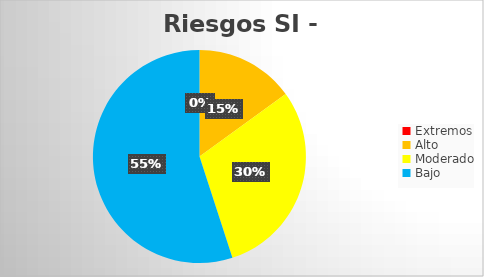
| Category | Riesgos SI - IUCMC |
|---|---|
| Extremos | 0 |
| Alto | 6 |
| Moderado | 12 |
| Bajo | 22 |